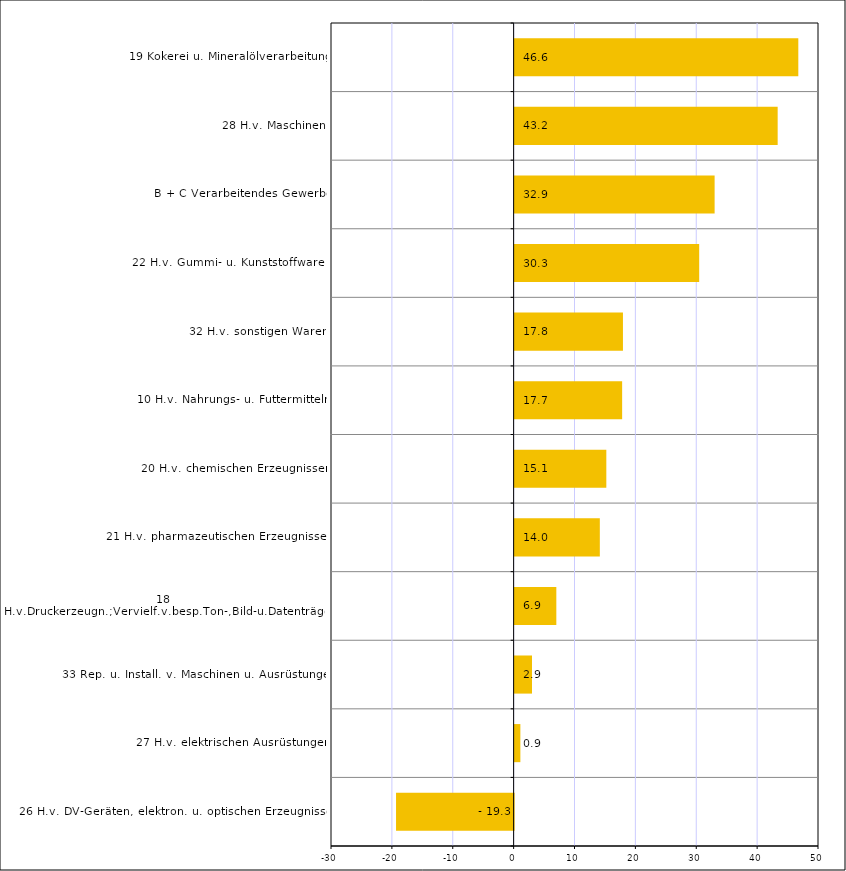
| Category | Series 0 |
|---|---|
| 26 H.v. DV-Geräten, elektron. u. optischen Erzeugnissen | -19.315 |
| 27 H.v. elektrischen Ausrüstungen | 0.943 |
| 33 Rep. u. Install. v. Maschinen u. Ausrüstungen | 2.856 |
| 18 H.v.Druckerzeugn.;Vervielf.v.besp.Ton-,Bild-u.Datenträgern | 6.851 |
| 21 H.v. pharmazeutischen Erzeugnissen | 13.996 |
| 20 H.v. chemischen Erzeugnissen | 15.063 |
| 10 H.v. Nahrungs- u. Futtermitteln | 17.662 |
| 32 H.v. sonstigen Waren | 17.795 |
| 22 H.v. Gummi- u. Kunststoffwaren | 30.319 |
| B + C Verarbeitendes Gewerbe | 32.852 |
| 28 H.v. Maschinen | 43.21 |
| 19 Kokerei u. Mineralölverarbeitung | 46.6 |